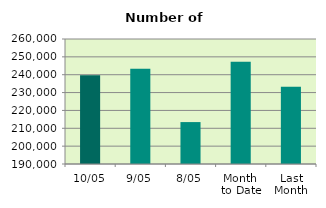
| Category | Series 0 |
|---|---|
| 10/05 | 239688 |
| 9/05 | 243358 |
| 8/05 | 213474 |
| Month 
to Date | 247298 |
| Last
Month | 233247 |